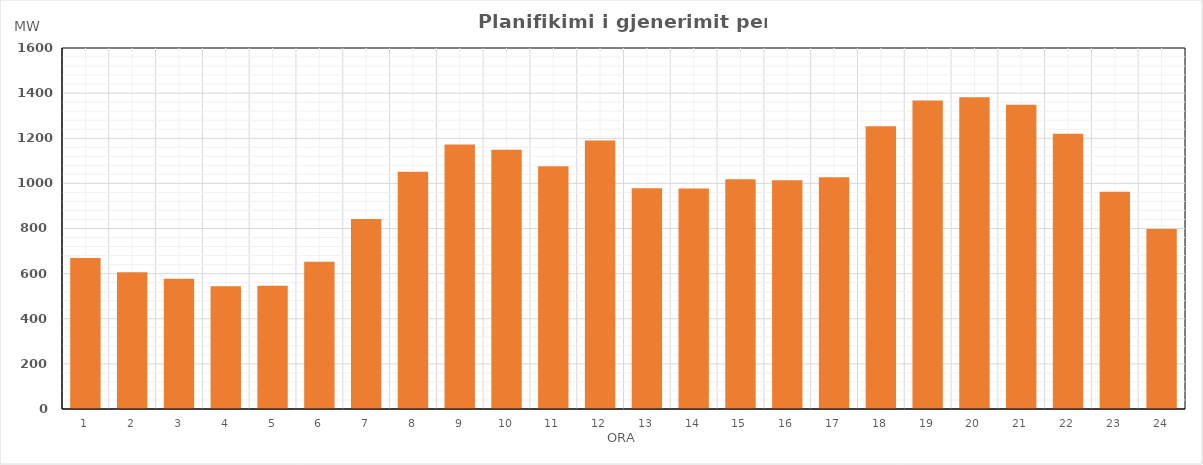
| Category | Max (MW) |
|---|---|
| 0 | 669.738 |
| 1 | 606.339 |
| 2 | 577.183 |
| 3 | 544.188 |
| 4 | 546.195 |
| 5 | 652.586 |
| 6 | 841.713 |
| 7 | 1051.959 |
| 8 | 1172.189 |
| 9 | 1149.066 |
| 10 | 1075.803 |
| 11 | 1189.777 |
| 12 | 978.697 |
| 13 | 977.669 |
| 14 | 1018.785 |
| 15 | 1013.675 |
| 16 | 1026.741 |
| 17 | 1253.24 |
| 18 | 1367.24 |
| 19 | 1382.141 |
| 20 | 1348.893 |
| 21 | 1220.272 |
| 22 | 963.396 |
| 23 | 797.24 |